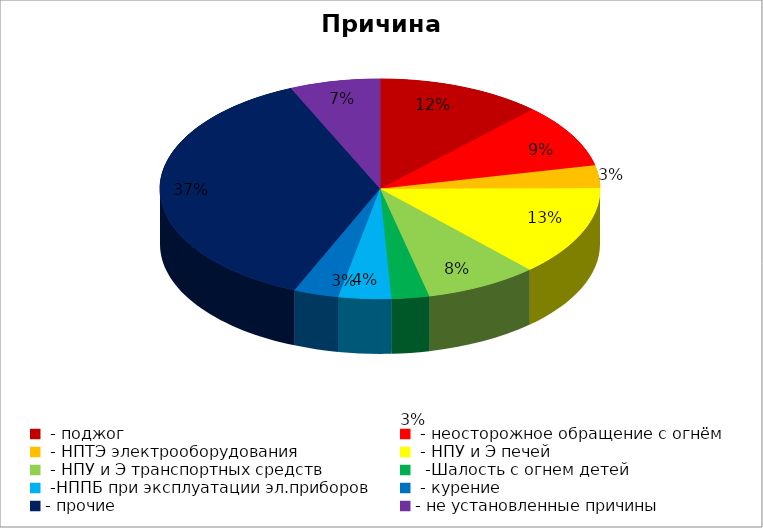
| Category | Причина пожара |
|---|---|
|  - поджог | 22 |
|  - неосторожное обращение с огнём | 17 |
|  - НПТЭ электрооборудования | 6 |
|  - НПУ и Э печей | 24 |
|  - НПУ и Э транспортных средств | 15 |
|   -Шалость с огнем детей | 5 |
|  -НППБ при эксплуатации эл.приборов | 7 |
|  - курение | 6 |
| - прочие | 67 |
| - не установленные причины | 12 |